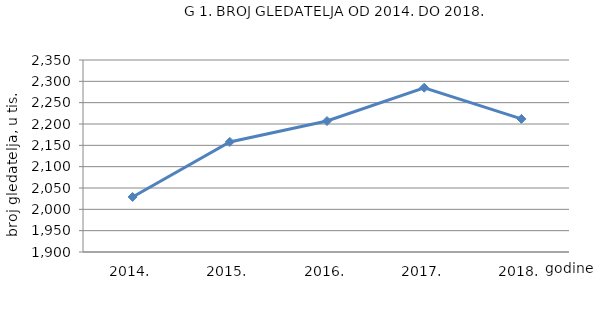
| Category | Series 0 |
|---|---|
| 2014. | 2029 |
| 2015. | 2158 |
| 2016. | 2207 |
| 2017. | 2285 |
| 2018. | 2212 |